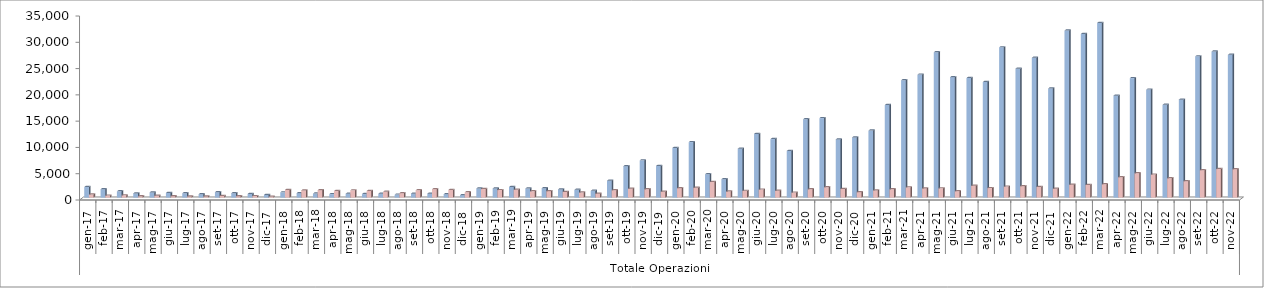
| Category | Series 0 | Series 1 |
|---|---|---|
| 0 | 2012 | 589 |
| 1 | 1601 | 381 |
| 2 | 1193 | 426 |
| 3 | 796 | 242 |
| 4 | 985 | 359 |
| 5 | 883 | 272 |
| 6 | 823 | 232 |
| 7 | 648 | 211 |
| 8 | 1028 | 328 |
| 9 | 837 | 277 |
| 10 | 693 | 288 |
| 11 | 511 | 190 |
| 12 | 996 | 1463 |
| 13 | 849 | 1374 |
| 14 | 765 | 1415 |
| 15 | 668 | 1245 |
| 16 | 737 | 1382 |
| 17 | 673 | 1258 |
| 18 | 732 | 1099 |
| 19 | 570 | 843 |
| 20 | 752 | 1388 |
| 21 | 752 | 1594 |
| 22 | 648 | 1454 |
| 23 | 466 | 1005 |
| 24 | 1741 | 1625 |
| 25 | 1745 | 1430 |
| 26 | 2021 | 1484 |
| 27 | 1730 | 1196 |
| 28 | 1790 | 1232 |
| 29 | 1559 | 1076 |
| 30 | 1484 | 963 |
| 31 | 1293 | 755 |
| 32 | 3217 | 1400 |
| 33 | 5987 | 1697 |
| 34 | 7090 | 1587 |
| 35 | 6030 | 1131 |
| 36 | 9451 | 1801 |
| 37 | 10561 | 1874 |
| 38 | 4442 | 2963 |
| 39 | 3496 | 1154 |
| 40 | 9296 | 1282 |
| 41 | 12120 | 1525 |
| 42 | 11135 | 1297 |
| 43 | 8877 | 955 |
| 44 | 14903 | 1592 |
| 45 | 15123 | 1971 |
| 46 | 11075 | 1637 |
| 47 | 11456 | 1038 |
| 48 | 12756 | 1373 |
| 49 | 17612 | 1579 |
| 50 | 22323 | 1951 |
| 51 | 23401 | 1754 |
| 52 | 27652 | 1762 |
| 53 | 22918 | 1212 |
| 54 | 22750 | 2248 |
| 55 | 21988 | 1811 |
| 56 | 28587 | 2089 |
| 57 | 24526 | 2173 |
| 58 | 26608 | 2017 |
| 59 | 20755 | 1690 |
| 60 | 31777 | 2455 |
| 61 | 31128 | 2403 |
| 62 | 33234 | 2539 |
| 63 | 19395 | 3881 |
| 64 | 22731 | 4626 |
| 65 | 20543 | 4376 |
| 66 | 17657 | 3675 |
| 67 | 18639 | 3129 |
| 68 | 26870 | 5225 |
| 69 | 27796 | 5426 |
| 70 | 27163 | 5403 |